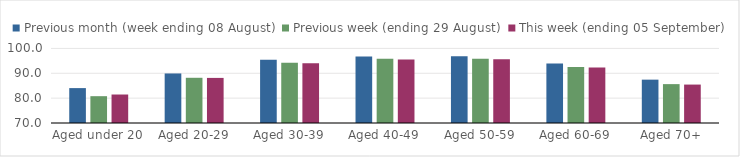
| Category | Previous month (week ending 08 August) | Previous week (ending 29 August) | This week (ending 05 September) |
|---|---|---|---|
| Aged under 20 | 84.04 | 80.79 | 81.46 |
| Aged 20-29 | 89.93 | 88.19 | 88.14 |
| Aged 30-39 | 95.43 | 94.24 | 94.02 |
| Aged 40-49 | 96.79 | 95.86 | 95.57 |
| Aged 50-59 | 96.9 | 95.81 | 95.61 |
| Aged 60-69 | 93.9 | 92.49 | 92.34 |
| Aged 70+ | 87.44 | 85.64 | 85.46 |